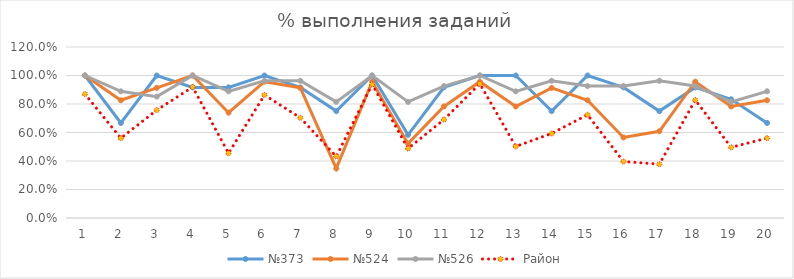
| Category | №373 | №524 | №526 | Район |
|---|---|---|---|---|
| 0 | 1 | 1 | 1 | 0.869 |
| 1 | 0.667 | 0.826 | 0.889 | 0.56 |
| 2 | 1 | 0.913 | 0.852 | 0.757 |
| 3 | 0.917 | 1 | 1 | 0.919 |
| 4 | 0.917 | 0.739 | 0.889 | 0.454 |
| 5 | 1 | 0.957 | 0.963 | 0.863 |
| 6 | 0.917 | 0.913 | 0.963 | 0.703 |
| 7 | 0.75 | 0.348 | 0.815 | 0.432 |
| 8 | 1 | 0.957 | 1 | 0.938 |
| 9 | 0.583 | 0.522 | 0.815 | 0.488 |
| 10 | 0.917 | 0.783 | 0.926 | 0.691 |
| 11 | 1 | 0.957 | 1 | 0.942 |
| 12 | 1 | 0.783 | 0.889 | 0.502 |
| 13 | 0.75 | 0.913 | 0.963 | 0.593 |
| 14 | 1 | 0.826 | 0.926 | 0.724 |
| 15 | 0.917 | 0.565 | 0.926 | 0.396 |
| 16 | 0.75 | 0.609 | 0.963 | 0.378 |
| 17 | 0.917 | 0.957 | 0.926 | 0.828 |
| 18 | 0.833 | 0.783 | 0.815 | 0.496 |
| 19 | 0.667 | 0.826 | 0.889 | 0.56 |